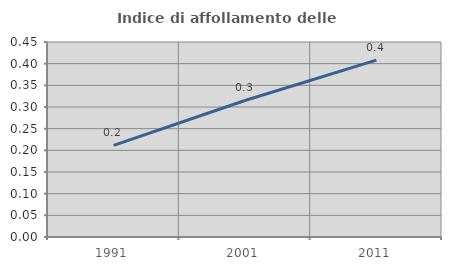
| Category | Indice di affollamento delle abitazioni  |
|---|---|
| 1991.0 | 0.212 |
| 2001.0 | 0.315 |
| 2011.0 | 0.408 |